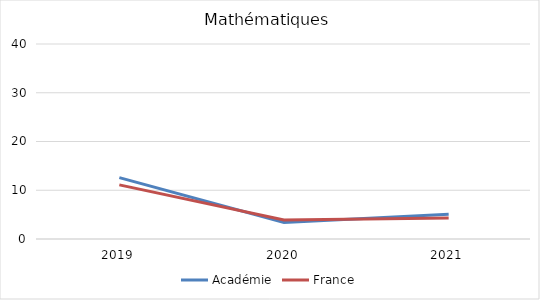
| Category | Académie | France |
|---|---|---|
| 2019.0 | 12.6 | 11.1 |
| 2020.0 | 3.4 | 3.9 |
| 2021.0 | 5.1 | 4.3 |